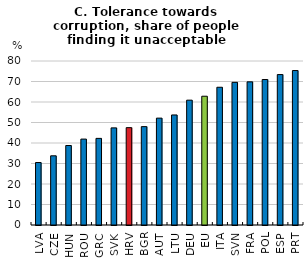
| Category | Tolerance towards corruption, share of people finding it unacceptable |
|---|---|
| LVA | 30.473 |
| CZE | 33.752 |
| HUN | 38.78 |
| ROU | 41.908 |
| GRC | 42.251 |
| SVK | 47.374 |
| HRV | 47.49 |
| BGR | 47.981 |
| AUT | 52.127 |
| LTU | 53.678 |
| DEU | 60.895 |
| EU | 62.813 |
| ITA | 67.191 |
| SVN | 69.583 |
| FRA | 69.826 |
| POL | 70.961 |
| ESP | 73.38 |
| PRT | 75.348 |